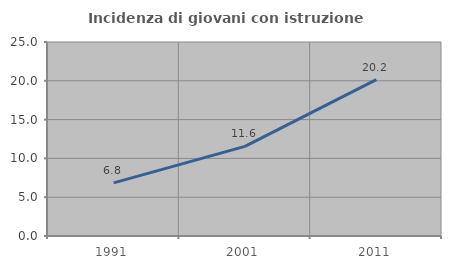
| Category | Incidenza di giovani con istruzione universitaria |
|---|---|
| 1991.0 | 6.844 |
| 2001.0 | 11.55 |
| 2011.0 | 20.161 |